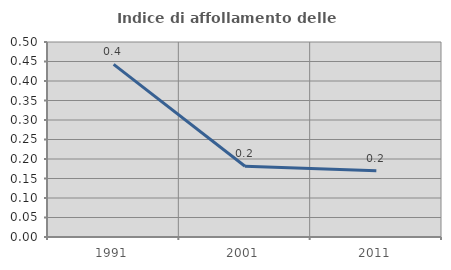
| Category | Indice di affollamento delle abitazioni  |
|---|---|
| 1991.0 | 0.442 |
| 2001.0 | 0.181 |
| 2011.0 | 0.17 |